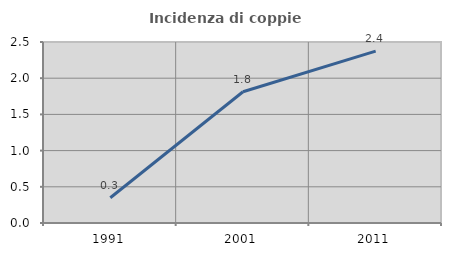
| Category | Incidenza di coppie miste |
|---|---|
| 1991.0 | 0.348 |
| 2001.0 | 1.813 |
| 2011.0 | 2.374 |